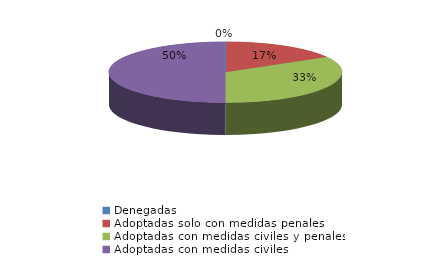
| Category | Series 0 |
|---|---|
| Denegadas | 0 |
| Adoptadas solo con medidas penales | 1 |
| Adoptadas con medidas civiles y penales | 2 |
| Adoptadas con medidas civiles | 3 |